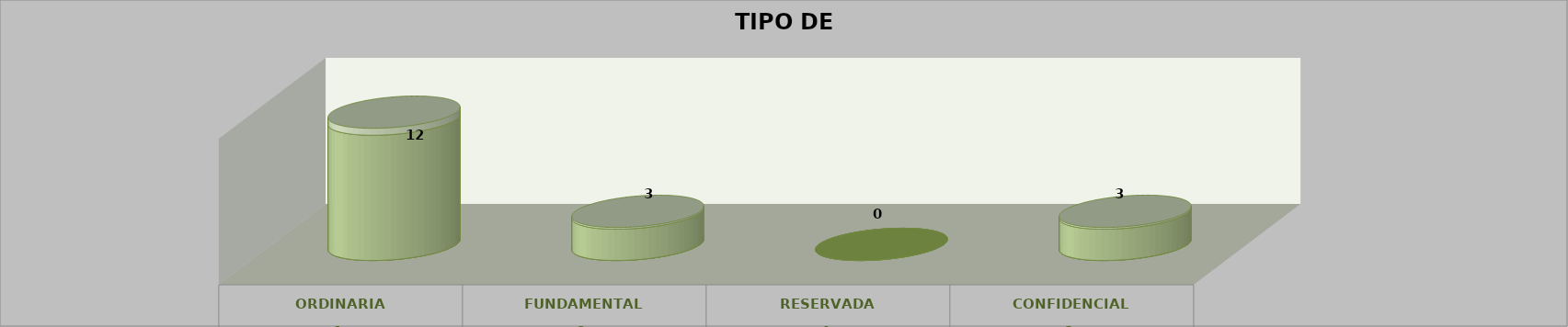
| Category | Series 0 | Series 2 | Series 1 | Series 3 | Series 4 |
|---|---|---|---|---|---|
| 0 |  |  |  | 12 | 0.667 |
| 1 |  |  |  | 3 | 0.167 |
| 2 |  |  |  | 0 | 0 |
| 3 |  |  |  | 3 | 0.167 |